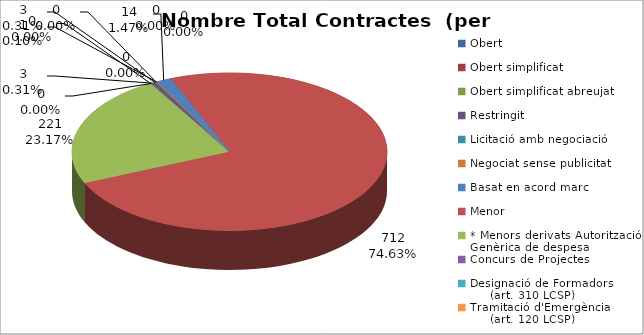
| Category | Nombre Total Contractes |
|---|---|
| Obert | 3 |
| Obert simplificat | 3 |
| Obert simplificat abreujat | 0 |
| Restringit | 0 |
| Licitació amb negociació | 0 |
| Negociat sense publicitat | 1 |
| Basat en acord marc | 14 |
| Menor | 712 |
| * Menors derivats Autorització Genèrica de despesa | 221 |
| Concurs de Projectes | 0 |
| Designació de Formadors
     (art. 310 LCSP) | 0 |
| Tramitació d'Emergència
     (art. 120 LCSP) | 0 |